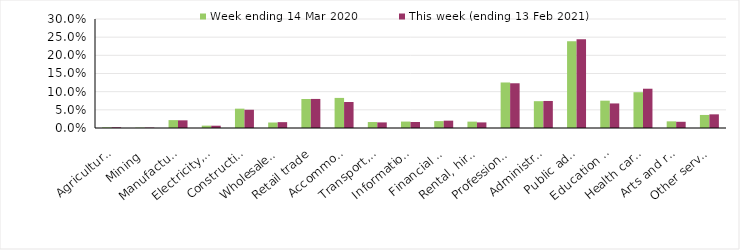
| Category | Week ending 14 Mar 2020 | This week (ending 13 Feb 2021) |
|---|---|---|
| Agriculture, forestry and fishing | 0.002 | 0.002 |
| Mining | 0.001 | 0.001 |
| Manufacturing | 0.022 | 0.021 |
| Electricity, gas, water and waste services | 0.006 | 0.006 |
| Construction | 0.053 | 0.05 |
| Wholesale trade | 0.015 | 0.016 |
| Retail trade | 0.08 | 0.08 |
| Accommodation and food services | 0.083 | 0.072 |
| Transport, postal and warehousing | 0.016 | 0.015 |
| Information media and telecommunications | 0.018 | 0.017 |
| Financial and insurance services | 0.019 | 0.02 |
| Rental, hiring and real estate services | 0.018 | 0.015 |
| Professional, scientific and technical services | 0.125 | 0.123 |
| Administrative and support services | 0.074 | 0.074 |
| Public administration and safety | 0.238 | 0.245 |
| Education and training | 0.075 | 0.068 |
| Health care and social assistance | 0.098 | 0.108 |
| Arts and recreation services | 0.018 | 0.017 |
| Other services | 0.036 | 0.038 |